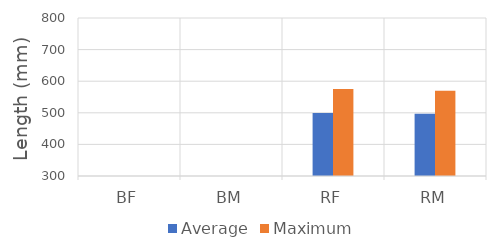
| Category | Average | Maximum |
|---|---|---|
| BF | 0 | 0 |
| BM | 0 | 0 |
| RF | 499 | 575 |
| RM | 497 | 570 |